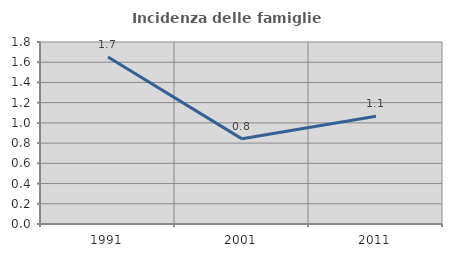
| Category | Incidenza delle famiglie numerose |
|---|---|
| 1991.0 | 1.651 |
| 2001.0 | 0.842 |
| 2011.0 | 1.065 |